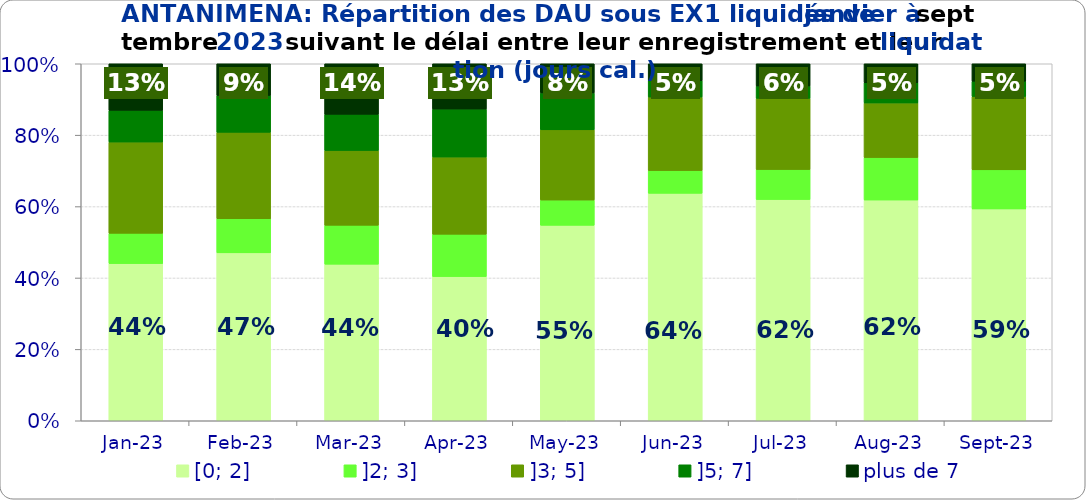
| Category | [0; 2] | ]2; 3] | ]3; 5] | ]5; 7] | plus de 7 |
|---|---|---|---|---|---|
| 2023-01-01 | 0.44 | 0.085 | 0.256 | 0.089 | 0.131 |
| 2023-02-01 | 0.47 | 0.096 | 0.242 | 0.103 | 0.089 |
| 2023-03-01 | 0.439 | 0.109 | 0.209 | 0.101 | 0.142 |
| 2023-04-01 | 0.404 | 0.119 | 0.216 | 0.134 | 0.127 |
| 2023-05-01 | 0.547 | 0.071 | 0.197 | 0.103 | 0.082 |
| 2023-06-01 | 0.637 | 0.064 | 0.206 | 0.046 | 0.047 |
| 2023-07-01 | 0.62 | 0.084 | 0.199 | 0.035 | 0.062 |
| 2023-08-01 | 0.618 | 0.119 | 0.153 | 0.057 | 0.053 |
| 2023-09-01 | 0.593 | 0.109 | 0.206 | 0.043 | 0.049 |